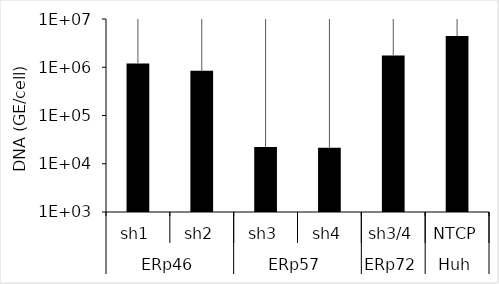
| Category | Series 0 |
|---|---|
| 0 | 1201353.869 |
| 1 | 847355.349 |
| 2 | 22236.801 |
| 3 | 21576.521 |
| 4 | 1761160.87 |
| 5 | 4443921.804 |